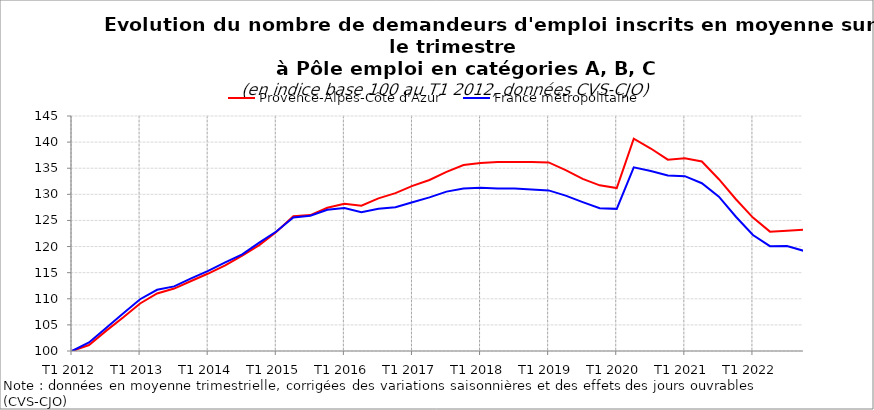
| Category | Provence-Alpes-Côte d'Azur | France métropolitaine |
|---|---|---|
| T1 2012 | 100 | 100 |
| T2 2012 | 101.142 | 101.645 |
| T3 2012 | 103.85 | 104.404 |
| T4 2012 | 106.408 | 107.193 |
| T1 2013 | 109.105 | 109.915 |
| T2 2013 | 111.022 | 111.721 |
| T3 2013 | 111.958 | 112.376 |
| T4 2013 | 113.399 | 113.901 |
| T1 2014 | 114.834 | 115.343 |
| T2 2014 | 116.411 | 116.959 |
| T3 2014 | 118.282 | 118.494 |
| T4 2014 | 120.275 | 120.757 |
| T1 2015 | 122.795 | 122.886 |
| T2 2015 | 125.797 | 125.557 |
| T3 2015 | 126.025 | 125.902 |
| T4 2015 | 127.431 | 127.042 |
| T1 2016 | 128.197 | 127.394 |
| T2 2016 | 127.817 | 126.562 |
| T3 2016 | 129.231 | 127.245 |
| T4 2016 | 130.228 | 127.525 |
| T1 2017 | 131.618 | 128.497 |
| T2 2017 | 132.754 | 129.415 |
| T3 2017 | 134.296 | 130.524 |
| T4 2017 | 135.623 | 131.119 |
| T1 2018 | 135.995 | 131.237 |
| T2 2018 | 136.177 | 131.129 |
| T3 2018 | 136.207 | 131.129 |
| T4 2018 | 136.177 | 130.948 |
| T1 2019 | 136.117 | 130.753 |
| T2 2019 | 134.622 | 129.75 |
| T3 2019 | 132.961 | 128.515 |
| T4 2019 | 131.726 | 127.352 |
| T1 2020 | 131.21 | 127.218 |
| T2 2020 | 140.661 | 135.178 |
| T3 2020 | 138.771 | 134.483 |
| T4 2020 | 136.631 | 133.619 |
| T1 2021 | 136.9 | 133.482 |
| T2 2021 | 136.281 | 132.129 |
| T3 2021 | 132.901 | 129.555 |
| T4 2021 | 129.057 | 125.709 |
| T1 2022 | 125.544 | 122.214 |
| T2 2022 | 122.858 | 120.067 |
| T3 2022 | 123.042 | 120.088 |
| T4 2022 | 123.238 | 119.164 |